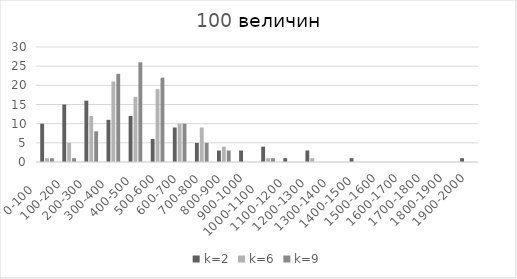
| Category | k=2 | k=6 | k=9 |
|---|---|---|---|
| 0-100     | 10 | 1 | 1 |
| 100-200   | 15 | 5 | 1 |
| 200-300   | 16 | 12 | 8 |
| 300-400   | 11 | 21 | 23 |
| 400-500  | 12 | 17 | 26 |
| 500-600 | 6 | 19 | 22 |
| 600-700 | 9 | 10 | 10 |
| 700-800 | 5 | 9 | 5 |
| 800-900 | 3 | 4 | 3 |
| 900-1000 | 3 | 0 | 0 |
| 1000-1100     | 4 | 1 | 1 |
| 1100-1200   | 1 | 0 | 0 |
| 1200-1300   | 3 | 1 | 0 |
| 1300-1400   | 0 | 0 | 0 |
| 1400-1500  | 1 | 0 | 0 |
| 1500-1600 | 0 | 0 | 0 |
| 1600-1700 | 0 | 0 | 0 |
| 1700-1800 | 0 | 0 | 0 |
| 1800-1900 | 0 | 0 | 0 |
| 1900-2000 | 1 | 0 | 0 |